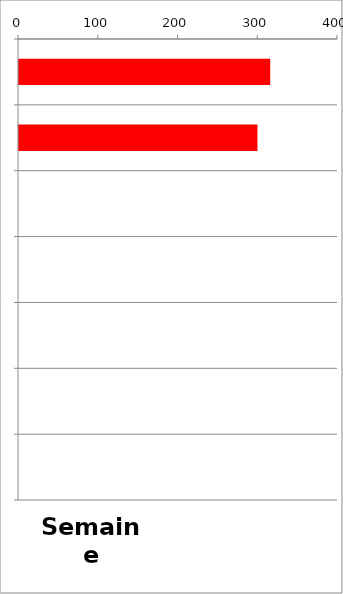
| Category | TV |
|---|---|
| 0 | 315 |
| 1 | 299 |
| 2 | 0 |
| 3 | 0 |
| 4 | 0 |
| 5 | 0 |
| 6 | 0 |